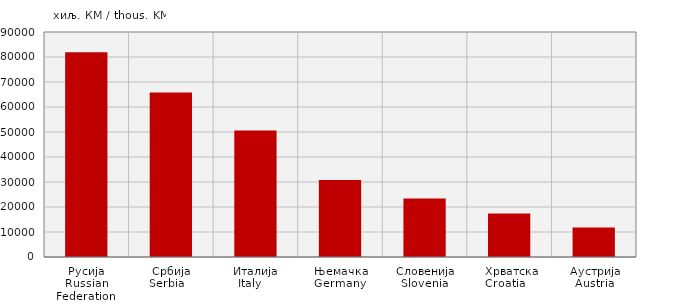
| Category | Увоз
Import |
|---|---|
| Русија
Russian Federation  | 81890 |
| Србија
Serbia    | 65826 |
| Италија
Italy    | 50630 |
| Њемачка
Germany  | 30822 |
| Словенија
Slovenia  | 23411 |
|  Хрватска
Croatia    | 17436 |
| Аустрија
Austria | 11818 |